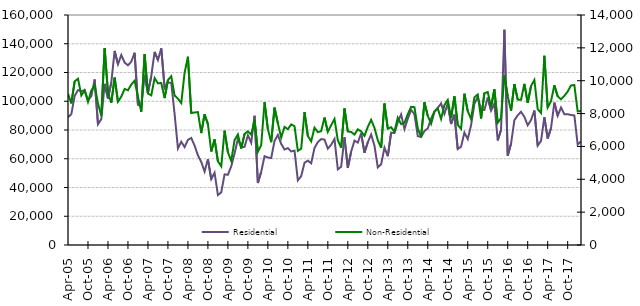
| Category | Residential |
|---|---|
| 2005-04-01 | 88840 |
| 2005-05-01 | 91030 |
| 2005-06-01 | 103700 |
| 2005-07-01 | 107770 |
| 2005-08-01 | 107040 |
| 2005-09-01 | 107710 |
| 2005-10-01 | 100650 |
| 2005-11-01 | 103570 |
| 2005-12-01 | 115150 |
| 2006-01-01 | 83980 |
| 2006-02-01 | 87550 |
| 2006-03-01 | 112090 |
| 2006-04-01 | 101830 |
| 2006-05-01 | 113160 |
| 2006-06-01 | 135030 |
| 2006-07-01 | 125720 |
| 2006-08-01 | 132180 |
| 2006-09-01 | 126890 |
| 2006-10-01 | 124980 |
| 2006-11-01 | 127530 |
| 2006-12-01 | 133770 |
| 2007-01-01 | 97580 |
| 2007-02-01 | 96560 |
| 2007-03-01 | 117970 |
| 2007-04-01 | 105780 |
| 2007-05-01 | 117560 |
| 2007-06-01 | 134370 |
| 2007-07-01 | 128660 |
| 2007-08-01 | 136790 |
| 2007-09-01 | 109250 |
| 2007-10-01 | 113080 |
| 2007-11-01 | 112770 |
| 2007-12-01 | 91140 |
| 2008-01-01 | 67220 |
| 2008-02-01 | 71820 |
| 2008-03-01 | 68100 |
| 2008-04-01 | 73130 |
| 2008-05-01 | 74470 |
| 2008-06-01 | 69150 |
| 2008-07-01 | 62400 |
| 2008-08-01 | 57810 |
| 2008-09-01 | 51080 |
| 2008-10-01 | 59710 |
| 2008-11-01 | 45780 |
| 2008-12-01 | 50260 |
| 2009-01-01 | 34750 |
| 2009-02-01 | 36580 |
| 2009-03-01 | 49130 |
| 2009-04-01 | 48840 |
| 2009-05-01 | 54720 |
| 2009-06-01 | 63710 |
| 2009-07-01 | 73760 |
| 2009-08-01 | 68080 |
| 2009-09-01 | 68260 |
| 2009-10-01 | 76320 |
| 2009-11-01 | 71150 |
| 2009-12-01 | 89920 |
| 2010-01-01 | 43110 |
| 2010-02-01 | 50920 |
| 2010-03-01 | 61810 |
| 2010-04-01 | 60830 |
| 2010-05-01 | 60500 |
| 2010-06-01 | 72370 |
| 2010-07-01 | 76590 |
| 2010-08-01 | 70320 |
| 2010-09-01 | 66440 |
| 2010-10-01 | 67380 |
| 2010-11-01 | 65080 |
| 2010-12-01 | 65650 |
| 2011-01-01 | 44970 |
| 2011-02-01 | 47830 |
| 2011-03-01 | 57200 |
| 2011-04-01 | 58700 |
| 2011-05-01 | 56820 |
| 2011-06-01 | 67500 |
| 2011-07-01 | 71550 |
| 2011-08-01 | 73720 |
| 2011-09-01 | 73310 |
| 2011-10-01 | 67030 |
| 2011-11-01 | 69730 |
| 2011-12-01 | 73780 |
| 2012-01-01 | 52630 |
| 2012-02-01 | 54440 |
| 2012-03-01 | 74960 |
| 2012-04-01 | 53590 |
| 2012-05-01 | 64960 |
| 2012-06-01 | 72590 |
| 2012-07-01 | 71240 |
| 2012-08-01 | 77690 |
| 2012-09-01 | 64200 |
| 2012-10-01 | 71490 |
| 2012-11-01 | 76910 |
| 2012-12-01 | 69100 |
| 2013-01-01 | 53990 |
| 2013-02-01 | 56120 |
| 2013-03-01 | 67740 |
| 2013-04-01 | 61780 |
| 2013-05-01 | 78170 |
| 2013-06-01 | 77850 |
| 2013-07-01 | 85310 |
| 2013-08-01 | 90850 |
| 2013-09-01 | 80640 |
| 2013-10-01 | 87730 |
| 2013-11-01 | 94020 |
| 2013-12-01 | 91030 |
| 2014-01-01 | 75750 |
| 2014-02-01 | 75100 |
| 2014-03-01 | 79280 |
| 2014-04-01 | 81140 |
| 2014-05-01 | 87930 |
| 2014-06-01 | 92950 |
| 2014-07-01 | 95430 |
| 2014-08-01 | 98450 |
| 2014-09-01 | 91170 |
| 2014-10-01 | 98630 |
| 2014-11-01 | 84150 |
| 2014-12-01 | 90650 |
| 2015-01-01 | 66750 |
| 2015-02-01 | 68390 |
| 2015-03-01 | 78240 |
| 2015-04-01 | 73690 |
| 2015-05-01 | 83310 |
| 2015-06-01 | 98200 |
| 2015-07-01 | 103160 |
| 2015-08-01 | 94260 |
| 2015-09-01 | 93940 |
| 2015-10-01 | 102540 |
| 2015-11-01 | 93490 |
| 2015-12-01 | 98400 |
| 2016-01-01 | 72750 |
| 2016-02-01 | 80110 |
| 2016-03-01 | 149710 |
| 2016-04-01 | 62150 |
| 2016-05-01 | 70480 |
| 2016-06-01 | 86840 |
| 2016-07-01 | 90220 |
| 2016-08-01 | 92660 |
| 2016-09-01 | 89130 |
| 2016-10-01 | 83270 |
| 2016-11-01 | 86930 |
| 2016-12-01 | 93570 |
| 2017-01-01 | 69120 |
| 2017-02-01 | 72400 |
| 2017-03-01 | 88860 |
| 2017-04-01 | 74080 |
| 2017-05-01 | 81310 |
| 2017-06-01 | 99050 |
| 2017-07-01 | 89910 |
| 2017-08-01 | 95610 |
| 2017-09-01 | 91010 |
| 2017-10-01 | 91000 |
| 2017-11-01 | 90410 |
| 2017-12-01 | 90160 |
| 2018-01-01 | 69910 |
| 2018-02-01 | 72140 |